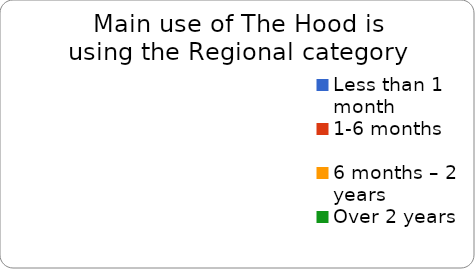
| Category | To use the Regional category |
|---|---|
| Less than 1 month | 0 |
| 1-6 months | 0 |
| 6 months – 2 years | 0 |
| Over 2 years | 0 |